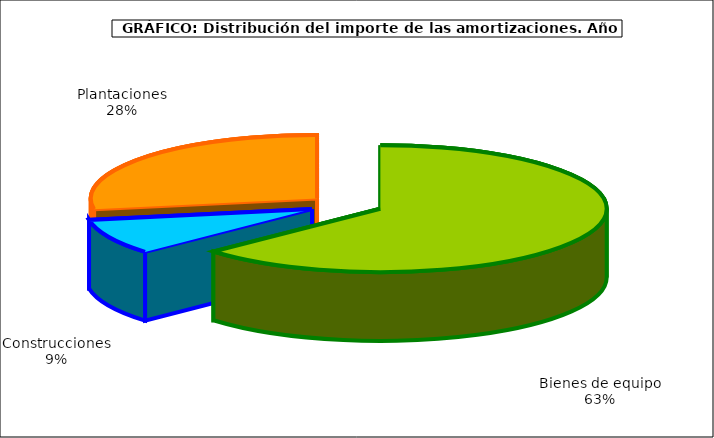
| Category | Series 0 |
|---|---|
| Bienes de equipo | 4292.052 |
| Construcciones | 615.17 |
| Plantaciones | 1883.146 |